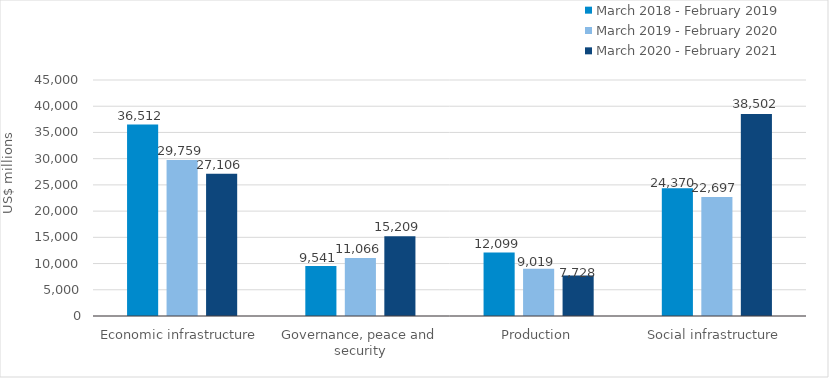
| Category | March 2018 - February 2019 | March 2019 - February 2020 | March 2020 - February 2021 |
|---|---|---|---|
| Economic infrastructure | 36512.025 | 29759.345 | 27105.91 |
| Governance, peace and security | 9541.287 | 11065.697 | 15209.233 |
| Production | 12098.736 | 9019.278 | 7728.394 |
| Social infrastructure | 24369.83 | 22696.601 | 38501.501 |